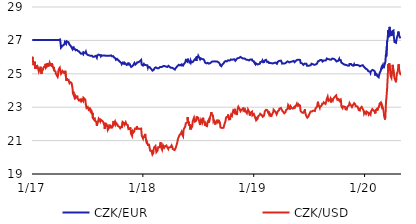
| Category | CZK/EUR | CZK/USD |
|---|---|---|
| 2017-01-02 | 27.02 | 25.819 |
| 2017-01-03 | 27.02 | 26.017 |
| 2017-01-04 | 27.02 | 25.889 |
| 2017-01-05 | 27.02 | 25.714 |
| 2017-01-06 | 27.02 | 25.516 |
| 2017-01-09 | 27.02 | 25.697 |
| 2017-01-10 | 27.02 | 25.571 |
| 2017-01-11 | 27.02 | 25.721 |
| 2017-01-12 | 27.02 | 25.3 |
| 2017-01-13 | 27.02 | 25.347 |
| 2017-01-16 | 27.02 | 25.503 |
| 2017-01-17 | 27.02 | 25.291 |
| 2017-01-18 | 27.02 | 25.335 |
| 2017-01-19 | 27.02 | 25.329 |
| 2017-01-20 | 27.02 | 25.414 |
| 2017-01-23 | 27.025 | 25.22 |
| 2017-01-24 | 27.02 | 25.141 |
| 2017-01-25 | 27.02 | 25.144 |
| 2017-01-26 | 27.02 | 25.252 |
| 2017-01-27 | 27.02 | 25.297 |
| 2017-01-30 | 27.02 | 25.421 |
| 2017-01-31 | 27.02 | 25.12 |
| 2017-02-01 | 27.02 | 25.074 |
| 2017-02-02 | 27.02 | 24.992 |
| 2017-02-03 | 27.02 | 25.155 |
| 2017-02-06 | 27.02 | 25.219 |
| 2017-02-07 | 27.02 | 25.306 |
| 2017-02-08 | 27.02 | 25.333 |
| 2017-02-09 | 27.02 | 25.268 |
| 2017-02-10 | 27.02 | 25.422 |
| 2017-02-13 | 27.02 | 25.421 |
| 2017-02-14 | 27.02 | 25.437 |
| 2017-02-15 | 27.02 | 25.596 |
| 2017-02-16 | 27.02 | 25.36 |
| 2017-02-17 | 27.02 | 25.372 |
| 2017-02-20 | 27.02 | 25.449 |
| 2017-02-21 | 27.02 | 25.644 |
| 2017-02-22 | 27.02 | 25.7 |
| 2017-02-23 | 27.02 | 25.556 |
| 2017-02-24 | 27.02 | 25.468 |
| 2017-02-27 | 27.02 | 25.522 |
| 2017-02-28 | 27.02 | 25.497 |
| 2017-03-01 | 27.02 | 25.654 |
| 2017-03-02 | 27.02 | 25.695 |
| 2017-03-03 | 27.02 | 25.574 |
| 2017-03-06 | 27.02 | 25.506 |
| 2017-03-07 | 27.02 | 25.547 |
| 2017-03-08 | 27.02 | 25.631 |
| 2017-03-09 | 27.02 | 25.613 |
| 2017-03-10 | 27.02 | 25.482 |
| 2017-03-13 | 27.02 | 25.339 |
| 2017-03-14 | 27.02 | 25.415 |
| 2017-03-15 | 27.02 | 25.434 |
| 2017-03-16 | 27.02 | 25.195 |
| 2017-03-17 | 27.02 | 25.154 |
| 2017-03-20 | 27.02 | 25.129 |
| 2017-03-21 | 27.02 | 25.009 |
| 2017-03-22 | 27.02 | 25.003 |
| 2017-03-23 | 27.02 | 25.05 |
| 2017-03-24 | 27.02 | 25.008 |
| 2017-03-27 | 27.02 | 24.813 |
| 2017-03-28 | 27.02 | 24.883 |
| 2017-03-29 | 27.02 | 25.14 |
| 2017-03-30 | 27.02 | 25.159 |
| 2017-03-31 | 27.03 | 25.282 |
| 2017-04-03 | 27.045 | 25.367 |
| 2017-04-04 | 27.055 | 25.404 |
| 2017-04-05 | 27.06 | 25.37 |
| 2017-04-06 | 26.75 | 25.076 |
| 2017-04-07 | 26.565 | 24.999 |
| 2017-04-10 | 26.53 | 25.082 |
| 2017-04-11 | 26.66 | 25.112 |
| 2017-04-12 | 26.695 | 25.172 |
| 2017-04-13 | 26.705 | 25.122 |
| 2017-04-18 | 26.76 | 25.053 |
| 2017-04-19 | 26.795 | 24.985 |
| 2017-04-20 | 26.91 | 25.043 |
| 2017-04-21 | 26.935 | 25.179 |
| 2017-04-24 | 26.795 | 24.706 |
| 2017-04-25 | 26.77 | 24.58 |
| 2017-04-26 | 26.945 | 24.735 |
| 2017-04-27 | 26.935 | 24.752 |
| 2017-04-28 | 26.92 | 24.629 |
| 2017-05-02 | 26.89 | 24.639 |
| 2017-05-03 | 26.87 | 24.607 |
| 2017-05-04 | 26.77 | 24.499 |
| 2017-05-05 | 26.78 | 24.433 |
| 2017-05-09 | 26.67 | 24.497 |
| 2017-05-10 | 26.64 | 24.486 |
| 2017-05-11 | 26.6 | 24.495 |
| 2017-05-12 | 26.575 | 24.435 |
| 2017-05-15 | 26.47 | 24.124 |
| 2017-05-16 | 26.42 | 23.888 |
| 2017-05-17 | 26.435 | 23.778 |
| 2017-05-18 | 26.63 | 23.927 |
| 2017-05-19 | 26.5 | 23.71 |
| 2017-05-22 | 26.485 | 23.557 |
| 2017-05-23 | 26.48 | 23.615 |
| 2017-05-24 | 26.465 | 23.642 |
| 2017-05-25 | 26.41 | 23.552 |
| 2017-05-26 | 26.435 | 23.606 |
| 2017-05-29 | 26.435 | 23.627 |
| 2017-05-30 | 26.465 | 23.69 |
| 2017-05-31 | 26.42 | 23.545 |
| 2017-06-01 | 26.395 | 23.554 |
| 2017-06-02 | 26.36 | 23.501 |
| 2017-06-05 | 26.325 | 23.401 |
| 2017-06-06 | 26.335 | 23.393 |
| 2017-06-07 | 26.315 | 23.459 |
| 2017-06-08 | 26.27 | 23.392 |
| 2017-06-09 | 26.22 | 23.463 |
| 2017-06-12 | 26.2 | 23.348 |
| 2017-06-13 | 26.145 | 23.308 |
| 2017-06-14 | 26.165 | 23.354 |
| 2017-06-15 | 26.21 | 23.468 |
| 2017-06-16 | 26.23 | 23.49 |
| 2017-06-19 | 26.17 | 23.369 |
| 2017-06-20 | 26.295 | 23.568 |
| 2017-06-21 | 26.265 | 23.565 |
| 2017-06-22 | 26.27 | 23.522 |
| 2017-06-23 | 26.295 | 23.53 |
| 2017-06-26 | 26.24 | 23.457 |
| 2017-06-27 | 26.27 | 23.29 |
| 2017-06-28 | 26.325 | 23.141 |
| 2017-06-29 | 26.285 | 23.032 |
| 2017-06-30 | 26.195 | 22.952 |
| 2017-07-03 | 26.14 | 22.993 |
| 2017-07-04 | 26.13 | 23.017 |
| 2017-07-07 | 26.08 | 22.852 |
| 2017-07-10 | 26.095 | 22.917 |
| 2017-07-11 | 26.125 | 22.907 |
| 2017-07-12 | 26.11 | 22.804 |
| 2017-07-13 | 26.12 | 22.878 |
| 2017-07-14 | 26.075 | 22.842 |
| 2017-07-17 | 26.09 | 22.762 |
| 2017-07-18 | 26.08 | 22.57 |
| 2017-07-19 | 26.035 | 22.572 |
| 2017-07-20 | 26.04 | 22.671 |
| 2017-07-21 | 26.02 | 22.347 |
| 2017-07-24 | 26.025 | 22.344 |
| 2017-07-25 | 26.02 | 22.25 |
| 2017-07-26 | 26.045 | 22.371 |
| 2017-07-27 | 26.045 | 22.269 |
| 2017-07-28 | 26.05 | 22.209 |
| 2017-07-31 | 26.08 | 22.24 |
| 2017-08-01 | 26.13 | 22.123 |
| 2017-08-02 | 26.125 | 22.099 |
| 2017-08-03 | 25.965 | 21.89 |
| 2017-08-04 | 26.065 | 21.961 |
| 2017-08-07 | 26.115 | 22.135 |
| 2017-08-08 | 26.15 | 22.134 |
| 2017-08-09 | 26.16 | 22.301 |
| 2017-08-10 | 26.16 | 22.297 |
| 2017-08-11 | 26.155 | 22.232 |
| 2017-08-14 | 26.12 | 22.143 |
| 2017-08-15 | 26.14 | 22.26 |
| 2017-08-16 | 26.045 | 22.243 |
| 2017-08-17 | 26.01 | 22.24 |
| 2017-08-18 | 26.11 | 22.243 |
| 2017-08-21 | 26.085 | 22.177 |
| 2017-08-22 | 26.085 | 22.16 |
| 2017-08-23 | 26.125 | 22.14 |
| 2017-08-24 | 26.1 | 22.106 |
| 2017-08-25 | 26.085 | 22.098 |
| 2017-08-28 | 26.1 | 21.887 |
| 2017-08-29 | 26.14 | 21.697 |
| 2017-08-30 | 26.045 | 21.849 |
| 2017-08-31 | 26.105 | 22.073 |
| 2017-09-01 | 26.075 | 21.871 |
| 2017-09-04 | 26.06 | 21.895 |
| 2017-09-05 | 26.075 | 21.928 |
| 2017-09-06 | 26.11 | 21.88 |
| 2017-09-07 | 26.11 | 21.801 |
| 2017-09-08 | 26.1 | 21.641 |
| 2017-09-11 | 26.075 | 21.736 |
| 2017-09-12 | 26.105 | 21.87 |
| 2017-09-13 | 26.1 | 21.787 |
| 2017-09-14 | 26.1 | 21.953 |
| 2017-09-15 | 26.08 | 21.794 |
| 2017-09-18 | 26.09 | 21.836 |
| 2017-09-19 | 26.105 | 21.809 |
| 2017-09-20 | 26.09 | 21.734 |
| 2017-09-21 | 26.085 | 21.891 |
| 2017-09-22 | 26.045 | 21.771 |
| 2017-09-25 | 26.035 | 21.937 |
| 2017-09-26 | 26.055 | 22.103 |
| 2017-09-27 | 26.035 | 22.176 |
| 2017-09-29 | 25.975 | 22.003 |
| 2017-10-02 | 25.995 | 22.135 |
| 2017-10-03 | 25.93 | 22.065 |
| 2017-10-04 | 25.885 | 21.97 |
| 2017-10-05 | 25.835 | 22.003 |
| 2017-10-06 | 25.815 | 22.05 |
| 2017-10-09 | 25.89 | 22.044 |
| 2017-10-10 | 25.9 | 21.96 |
| 2017-10-11 | 25.88 | 21.878 |
| 2017-10-12 | 25.89 | 21.837 |
| 2017-10-13 | 25.81 | 21.852 |
| 2017-10-16 | 25.765 | 21.828 |
| 2017-10-17 | 25.735 | 21.885 |
| 2017-10-18 | 25.705 | 21.881 |
| 2017-10-19 | 25.725 | 21.736 |
| 2017-10-20 | 25.69 | 21.739 |
| 2017-10-23 | 25.64 | 21.84 |
| 2017-10-24 | 25.58 | 21.753 |
| 2017-10-25 | 25.59 | 21.715 |
| 2017-10-26 | 25.585 | 21.779 |
| 2017-10-27 | 25.67 | 22.117 |
| 2017-10-30 | 25.645 | 22.086 |
| 2017-10-31 | 25.67 | 22.06 |
| 2017-11-01 | 25.555 | 22.008 |
| 2017-11-02 | 25.56 | 21.949 |
| 2017-11-03 | 25.65 | 22.006 |
| 2017-11-06 | 25.61 | 22.098 |
| 2017-11-07 | 25.59 | 22.132 |
| 2017-11-08 | 25.56 | 22.053 |
| 2017-11-09 | 25.53 | 21.954 |
| 2017-11-10 | 25.545 | 21.923 |
| 2017-11-13 | 25.565 | 21.929 |
| 2017-11-14 | 25.565 | 21.766 |
| 2017-11-15 | 25.67 | 21.684 |
| 2017-11-16 | 25.56 | 21.712 |
| 2017-11-20 | 25.565 | 21.701 |
| 2017-11-21 | 25.53 | 21.791 |
| 2017-11-22 | 25.47 | 21.677 |
| 2017-11-23 | 25.46 | 21.487 |
| 2017-11-24 | 25.41 | 21.392 |
| 2017-11-27 | 25.43 | 21.279 |
| 2017-11-28 | 25.46 | 21.418 |
| 2017-11-29 | 25.475 | 21.542 |
| 2017-11-30 | 25.495 | 21.519 |
| 2017-12-01 | 25.525 | 21.475 |
| 2017-12-04 | 25.56 | 21.541 |
| 2017-12-05 | 25.655 | 21.656 |
| 2017-12-06 | 25.635 | 21.695 |
| 2017-12-07 | 25.61 | 21.727 |
| 2017-12-08 | 25.555 | 21.765 |
| 2017-12-11 | 25.6 | 21.705 |
| 2017-12-12 | 25.625 | 21.776 |
| 2017-12-13 | 25.65 | 21.86 |
| 2017-12-14 | 25.685 | 21.682 |
| 2017-12-15 | 25.68 | 21.75 |
| 2017-12-18 | 25.685 | 21.775 |
| 2017-12-19 | 25.66 | 21.702 |
| 2017-12-20 | 25.675 | 21.677 |
| 2017-12-21 | 25.715 | 21.684 |
| 2017-12-22 | 25.75 | 21.725 |
| 2017-12-27 | 25.84 | 21.723 |
| 2017-12-28 | 25.645 | 21.489 |
| 2017-12-29 | 25.54 | 21.291 |
| 2018-01-02 | 25.495 | 21.13 |
| 2018-01-03 | 25.545 | 21.238 |
| 2018-01-04 | 25.51 | 21.16 |
| 2018-01-05 | 25.595 | 21.248 |
| 2018-01-08 | 25.525 | 21.324 |
| 2018-01-09 | 25.535 | 21.399 |
| 2018-01-10 | 25.565 | 21.315 |
| 2018-01-11 | 25.545 | 21.256 |
| 2018-01-12 | 25.52 | 21.025 |
| 2018-01-15 | 25.53 | 20.796 |
| 2018-01-16 | 25.515 | 20.863 |
| 2018-01-17 | 25.445 | 20.852 |
| 2018-01-18 | 25.37 | 20.742 |
| 2018-01-19 | 25.43 | 20.749 |
| 2018-01-22 | 25.4 | 20.752 |
| 2018-01-23 | 25.405 | 20.742 |
| 2018-01-24 | 25.375 | 20.543 |
| 2018-01-25 | 25.38 | 20.454 |
| 2018-01-26 | 25.355 | 20.392 |
| 2018-01-29 | 25.295 | 20.432 |
| 2018-01-30 | 25.33 | 20.394 |
| 2018-01-31 | 25.27 | 20.291 |
| 2018-02-01 | 25.265 | 20.281 |
| 2018-02-02 | 25.19 | 20.163 |
| 2018-02-05 | 25.2 | 20.256 |
| 2018-02-06 | 25.23 | 20.464 |
| 2018-02-07 | 25.23 | 20.448 |
| 2018-02-08 | 25.245 | 20.595 |
| 2018-02-09 | 25.335 | 20.645 |
| 2018-02-12 | 25.355 | 20.677 |
| 2018-02-13 | 25.385 | 20.583 |
| 2018-02-14 | 25.36 | 20.539 |
| 2018-02-15 | 25.37 | 20.307 |
| 2018-02-16 | 25.34 | 20.327 |
| 2018-02-19 | 25.325 | 20.406 |
| 2018-02-20 | 25.315 | 20.515 |
| 2018-02-21 | 25.36 | 20.604 |
| 2018-02-22 | 25.315 | 20.623 |
| 2018-02-23 | 25.335 | 20.603 |
| 2018-02-26 | 25.39 | 20.608 |
| 2018-02-27 | 25.405 | 20.652 |
| 2018-02-28 | 25.42 | 20.816 |
| 2018-03-01 | 25.435 | 20.898 |
| 2018-03-02 | 25.41 | 20.638 |
| 2018-03-05 | 25.405 | 20.642 |
| 2018-03-06 | 25.38 | 20.45 |
| 2018-03-07 | 25.415 | 20.47 |
| 2018-03-08 | 25.43 | 20.472 |
| 2018-03-09 | 25.455 | 20.717 |
| 2018-03-12 | 25.45 | 20.688 |
| 2018-03-13 | 25.47 | 20.577 |
| 2018-03-14 | 25.445 | 20.573 |
| 2018-03-15 | 25.415 | 20.594 |
| 2018-03-16 | 25.415 | 20.666 |
| 2018-03-19 | 25.43 | 20.661 |
| 2018-03-20 | 25.42 | 20.707 |
| 2018-03-21 | 25.42 | 20.689 |
| 2018-03-22 | 25.4 | 20.624 |
| 2018-03-23 | 25.405 | 20.586 |
| 2018-03-26 | 25.445 | 20.506 |
| 2018-03-27 | 25.475 | 20.586 |
| 2018-03-28 | 25.46 | 20.533 |
| 2018-03-29 | 25.43 | 20.641 |
| 2018-04-03 | 25.365 | 20.608 |
| 2018-04-04 | 25.34 | 20.645 |
| 2018-04-05 | 25.325 | 20.655 |
| 2018-04-06 | 25.34 | 20.714 |
| 2018-04-09 | 25.355 | 20.608 |
| 2018-04-10 | 25.335 | 20.497 |
| 2018-04-11 | 25.325 | 20.449 |
| 2018-04-12 | 25.315 | 20.548 |
| 2018-04-13 | 25.305 | 20.545 |
| 2018-04-16 | 25.26 | 20.435 |
| 2018-04-17 | 25.255 | 20.439 |
| 2018-04-18 | 25.3 | 20.424 |
| 2018-04-19 | 25.325 | 20.454 |
| 2018-04-20 | 25.34 | 20.584 |
| 2018-04-23 | 25.41 | 20.763 |
| 2018-04-24 | 25.435 | 20.827 |
| 2018-04-25 | 25.465 | 20.899 |
| 2018-04-26 | 25.475 | 20.944 |
| 2018-04-27 | 25.47 | 21.102 |
| 2018-04-30 | 25.54 | 21.144 |
| 2018-05-02 | 25.595 | 21.319 |
| 2018-05-03 | 25.58 | 21.332 |
| 2018-05-04 | 25.505 | 21.31 |
| 2018-05-07 | 25.515 | 21.438 |
| 2018-05-09 | 25.565 | 21.525 |
| 2018-05-10 | 25.495 | 21.465 |
| 2018-05-11 | 25.505 | 21.37 |
| 2018-05-14 | 25.49 | 21.264 |
| 2018-05-15 | 25.55 | 21.501 |
| 2018-05-16 | 25.545 | 21.679 |
| 2018-05-17 | 25.56 | 21.646 |
| 2018-05-18 | 25.59 | 21.718 |
| 2018-05-21 | 25.68 | 21.84 |
| 2018-05-22 | 25.7 | 21.791 |
| 2018-05-23 | 25.815 | 22.041 |
| 2018-05-24 | 25.81 | 22.011 |
| 2018-05-25 | 25.765 | 22.07 |
| 2018-05-28 | 25.73 | 22.095 |
| 2018-05-29 | 25.905 | 22.413 |
| 2018-05-30 | 25.835 | 22.202 |
| 2018-05-31 | 25.79 | 22.05 |
| 2018-06-01 | 25.83 | 22.137 |
| 2018-06-04 | 25.7 | 21.897 |
| 2018-06-05 | 25.65 | 21.971 |
| 2018-06-06 | 25.645 | 21.798 |
| 2018-06-07 | 25.64 | 21.662 |
| 2018-06-08 | 25.795 | 21.944 |
| 2018-06-11 | 25.68 | 21.781 |
| 2018-06-12 | 25.65 | 21.757 |
| 2018-06-13 | 25.71 | 21.856 |
| 2018-06-14 | 25.65 | 21.866 |
| 2018-06-15 | 25.71 | 22.171 |
| 2018-06-18 | 25.74 | 22.165 |
| 2018-06-19 | 25.81 | 22.373 |
| 2018-06-20 | 25.835 | 22.316 |
| 2018-06-21 | 25.865 | 22.413 |
| 2018-06-22 | 25.79 | 22.139 |
| 2018-06-25 | 25.935 | 22.172 |
| 2018-06-26 | 25.9 | 22.188 |
| 2018-06-27 | 25.77 | 22.184 |
| 2018-06-28 | 26 | 22.448 |
| 2018-06-29 | 26.02 | 22.318 |
| 2018-07-02 | 26 | 22.343 |
| 2018-07-03 | 26.075 | 22.356 |
| 2018-07-04 | 26.03 | 22.357 |
| 2018-07-09 | 25.86 | 21.934 |
| 2018-07-10 | 25.9 | 22.113 |
| 2018-07-11 | 25.93 | 22.099 |
| 2018-07-12 | 25.94 | 22.25 |
| 2018-07-13 | 25.92 | 22.262 |
| 2018-07-16 | 25.88 | 22.082 |
| 2018-07-17 | 25.875 | 22.1 |
| 2018-07-18 | 25.855 | 22.268 |
| 2018-07-19 | 25.92 | 22.368 |
| 2018-07-20 | 25.875 | 22.175 |
| 2018-07-23 | 25.85 | 22.065 |
| 2018-07-24 | 25.76 | 22.006 |
| 2018-07-25 | 25.675 | 21.965 |
| 2018-07-26 | 25.645 | 21.891 |
| 2018-07-27 | 25.62 | 22.039 |
| 2018-07-30 | 25.625 | 21.931 |
| 2018-07-31 | 25.6 | 21.814 |
| 2018-08-01 | 25.59 | 21.889 |
| 2018-08-02 | 25.6 | 22.04 |
| 2018-08-03 | 25.66 | 22.144 |
| 2018-08-06 | 25.65 | 22.221 |
| 2018-08-07 | 25.605 | 22.072 |
| 2018-08-08 | 25.58 | 22.076 |
| 2018-08-09 | 25.57 | 22.057 |
| 2018-08-10 | 25.635 | 22.377 |
| 2018-08-13 | 25.66 | 22.503 |
| 2018-08-14 | 25.69 | 22.524 |
| 2018-08-15 | 25.71 | 22.709 |
| 2018-08-16 | 25.7 | 22.606 |
| 2018-08-17 | 25.73 | 22.583 |
| 2018-08-20 | 25.705 | 22.509 |
| 2018-08-21 | 25.74 | 22.376 |
| 2018-08-22 | 25.725 | 22.149 |
| 2018-08-23 | 25.71 | 22.207 |
| 2018-08-24 | 25.745 | 22.218 |
| 2018-08-27 | 25.745 | 22.127 |
| 2018-08-28 | 25.72 | 21.963 |
| 2018-08-29 | 25.745 | 22.08 |
| 2018-08-30 | 25.75 | 22.025 |
| 2018-08-31 | 25.735 | 22.089 |
| 2018-09-03 | 25.75 | 22.183 |
| 2018-09-04 | 25.73 | 22.256 |
| 2018-09-05 | 25.745 | 22.238 |
| 2018-09-06 | 25.715 | 22.09 |
| 2018-09-07 | 25.695 | 22.124 |
| 2018-09-10 | 25.65 | 22.166 |
| 2018-09-11 | 25.65 | 22.157 |
| 2018-09-12 | 25.59 | 22.096 |
| 2018-09-13 | 25.52 | 21.965 |
| 2018-09-14 | 25.475 | 21.79 |
| 2018-09-17 | 25.455 | 21.811 |
| 2018-09-18 | 25.45 | 21.761 |
| 2018-09-19 | 25.43 | 21.796 |
| 2018-09-20 | 25.56 | 21.71 |
| 2018-09-21 | 25.585 | 21.756 |
| 2018-09-24 | 25.615 | 21.763 |
| 2018-09-25 | 25.615 | 21.752 |
| 2018-09-26 | 25.605 | 21.819 |
| 2018-09-27 | 25.715 | 21.967 |
| 2018-10-01 | 25.765 | 22.201 |
| 2018-10-02 | 25.79 | 22.343 |
| 2018-10-03 | 25.78 | 22.329 |
| 2018-10-04 | 25.78 | 22.415 |
| 2018-10-05 | 25.74 | 22.372 |
| 2018-10-08 | 25.735 | 22.426 |
| 2018-10-09 | 25.805 | 22.564 |
| 2018-10-10 | 25.805 | 22.44 |
| 2018-10-11 | 25.85 | 22.335 |
| 2018-10-12 | 25.775 | 22.269 |
| 2018-10-15 | 25.8 | 22.277 |
| 2018-10-16 | 25.815 | 22.283 |
| 2018-10-17 | 25.845 | 22.418 |
| 2018-10-18 | 25.86 | 22.476 |
| 2018-10-19 | 25.865 | 22.552 |
| 2018-10-22 | 25.84 | 22.483 |
| 2018-10-23 | 25.815 | 22.49 |
| 2018-10-24 | 25.83 | 22.685 |
| 2018-10-25 | 25.83 | 22.627 |
| 2018-10-26 | 25.86 | 22.797 |
| 2018-10-29 | 25.85 | 22.715 |
| 2018-10-30 | 25.87 | 22.75 |
| 2018-10-31 | 25.92 | 22.902 |
| 2018-11-01 | 25.875 | 22.712 |
| 2018-11-02 | 25.78 | 22.581 |
| 2018-11-05 | 25.845 | 22.73 |
| 2018-11-06 | 25.835 | 22.606 |
| 2018-11-07 | 25.88 | 22.531 |
| 2018-11-08 | 25.885 | 22.653 |
| 2018-11-09 | 25.935 | 22.857 |
| 2018-11-12 | 25.94 | 23.029 |
| 2018-11-13 | 25.94 | 23.032 |
| 2018-11-14 | 25.995 | 23.013 |
| 2018-11-15 | 25.985 | 22.992 |
| 2018-11-16 | 25.985 | 22.903 |
| 2018-11-19 | 26.01 | 22.761 |
| 2018-11-20 | 26.03 | 22.794 |
| 2018-11-21 | 26 | 22.788 |
| 2018-11-22 | 25.99 | 22.79 |
| 2018-11-23 | 25.955 | 22.866 |
| 2018-11-26 | 25.92 | 22.808 |
| 2018-11-27 | 25.915 | 22.874 |
| 2018-11-28 | 25.93 | 22.977 |
| 2018-11-29 | 25.965 | 22.802 |
| 2018-11-30 | 25.955 | 22.848 |
| 2018-12-03 | 25.92 | 22.874 |
| 2018-12-04 | 25.9 | 22.702 |
| 2018-12-05 | 25.885 | 22.802 |
| 2018-12-06 | 25.89 | 22.796 |
| 2018-12-07 | 25.85 | 22.736 |
| 2018-12-10 | 25.865 | 22.64 |
| 2018-12-11 | 25.845 | 22.711 |
| 2018-12-12 | 25.865 | 22.796 |
| 2018-12-13 | 25.83 | 22.716 |
| 2018-12-14 | 25.795 | 22.858 |
| 2018-12-17 | 25.8 | 22.749 |
| 2018-12-18 | 25.755 | 22.638 |
| 2018-12-19 | 25.76 | 22.591 |
| 2018-12-20 | 25.76 | 22.497 |
| 2018-12-21 | 25.855 | 22.654 |
| 2018-12-27 | 25.86 | 22.733 |
| 2018-12-28 | 25.78 | 22.506 |
| 2018-12-31 | 25.725 | 22.466 |
| 2019-01-02 | 25.75 | 22.594 |
| 2019-01-03 | 25.68 | 22.634 |
| 2019-01-04 | 25.65 | 22.494 |
| 2019-01-07 | 25.575 | 22.347 |
| 2019-01-08 | 25.64 | 22.416 |
| 2019-01-09 | 25.63 | 22.376 |
| 2019-01-10 | 25.625 | 22.221 |
| 2019-01-11 | 25.605 | 22.199 |
| 2019-01-14 | 25.56 | 22.29 |
| 2019-01-15 | 25.57 | 22.382 |
| 2019-01-16 | 25.565 | 22.446 |
| 2019-01-17 | 25.535 | 22.407 |
| 2019-01-18 | 25.58 | 22.432 |
| 2019-01-21 | 25.595 | 22.528 |
| 2019-01-22 | 25.61 | 22.559 |
| 2019-01-23 | 25.695 | 22.605 |
| 2019-01-24 | 25.695 | 22.659 |
| 2019-01-25 | 25.695 | 22.644 |
| 2019-01-28 | 25.725 | 22.529 |
| 2019-01-29 | 25.745 | 22.541 |
| 2019-01-30 | 25.8 | 22.579 |
| 2019-01-31 | 25.76 | 22.427 |
| 2019-02-01 | 25.695 | 22.398 |
| 2019-02-04 | 25.73 | 22.48 |
| 2019-02-05 | 25.7 | 22.508 |
| 2019-02-06 | 25.785 | 22.629 |
| 2019-02-07 | 25.805 | 22.747 |
| 2019-02-08 | 25.805 | 22.745 |
| 2019-02-11 | 25.835 | 22.845 |
| 2019-02-12 | 25.87 | 22.901 |
| 2019-02-13 | 25.795 | 22.819 |
| 2019-02-14 | 25.79 | 22.885 |
| 2019-02-15 | 25.7 | 22.823 |
| 2019-02-18 | 25.715 | 22.703 |
| 2019-02-19 | 25.715 | 22.771 |
| 2019-02-20 | 25.68 | 22.646 |
| 2019-02-21 | 25.645 | 22.586 |
| 2019-02-22 | 25.665 | 22.662 |
| 2019-02-25 | 25.65 | 22.589 |
| 2019-02-26 | 25.665 | 22.594 |
| 2019-02-27 | 25.655 | 22.532 |
| 2019-02-28 | 25.6 | 22.425 |
| 2019-03-01 | 25.635 | 22.52 |
| 2019-03-04 | 25.625 | 22.6 |
| 2019-03-05 | 25.62 | 22.614 |
| 2019-03-06 | 25.595 | 22.641 |
| 2019-03-07 | 25.61 | 22.72 |
| 2019-03-08 | 25.64 | 22.848 |
| 2019-03-11 | 25.655 | 22.818 |
| 2019-03-12 | 25.67 | 22.768 |
| 2019-03-13 | 25.67 | 22.711 |
| 2019-03-14 | 25.67 | 22.724 |
| 2019-03-15 | 25.67 | 22.694 |
| 2019-03-18 | 25.615 | 22.571 |
| 2019-03-19 | 25.6 | 22.537 |
| 2019-03-20 | 25.645 | 22.587 |
| 2019-03-21 | 25.65 | 22.528 |
| 2019-03-22 | 25.725 | 22.761 |
| 2019-03-25 | 25.76 | 22.752 |
| 2019-03-26 | 25.77 | 22.823 |
| 2019-03-27 | 25.8 | 22.912 |
| 2019-03-28 | 25.78 | 22.934 |
| 2019-03-29 | 25.8 | 22.968 |
| 2019-04-01 | 25.79 | 22.955 |
| 2019-04-02 | 25.75 | 22.99 |
| 2019-04-03 | 25.725 | 22.876 |
| 2019-04-04 | 25.695 | 22.91 |
| 2019-04-05 | 25.61 | 22.8 |
| 2019-04-08 | 25.635 | 22.794 |
| 2019-04-09 | 25.62 | 22.716 |
| 2019-04-10 | 25.61 | 22.711 |
| 2019-04-11 | 25.605 | 22.732 |
| 2019-04-12 | 25.62 | 22.633 |
| 2019-04-15 | 25.625 | 22.653 |
| 2019-04-16 | 25.665 | 22.701 |
| 2019-04-17 | 25.655 | 22.702 |
| 2019-04-18 | 25.68 | 22.826 |
| 2019-04-23 | 25.745 | 22.896 |
| 2019-04-24 | 25.73 | 22.95 |
| 2019-04-25 | 25.735 | 23.137 |
| 2019-04-26 | 25.705 | 23.091 |
| 2019-04-29 | 25.68 | 23.028 |
| 2019-04-30 | 25.66 | 22.864 |
| 2019-05-02 | 25.645 | 22.875 |
| 2019-05-03 | 25.715 | 23.055 |
| 2019-05-06 | 25.715 | 22.962 |
| 2019-05-07 | 25.73 | 23.005 |
| 2019-05-09 | 25.72 | 22.983 |
| 2019-05-10 | 25.73 | 22.915 |
| 2019-05-13 | 25.775 | 22.918 |
| 2019-05-14 | 25.75 | 22.942 |
| 2019-05-15 | 25.76 | 23.035 |
| 2019-05-16 | 25.695 | 22.933 |
| 2019-05-17 | 25.75 | 23.048 |
| 2019-05-20 | 25.765 | 23.073 |
| 2019-05-21 | 25.775 | 23.096 |
| 2019-05-22 | 25.79 | 23.089 |
| 2019-05-23 | 25.82 | 23.181 |
| 2019-05-24 | 25.83 | 23.091 |
| 2019-05-27 | 25.835 | 23.074 |
| 2019-05-28 | 25.845 | 23.092 |
| 2019-05-29 | 25.86 | 23.179 |
| 2019-05-30 | 25.84 | 23.208 |
| 2019-05-31 | 25.817 | 23.153 |
| 2019-06-03 | 25.83 | 23.093 |
| 2019-06-04 | 25.745 | 22.906 |
| 2019-06-05 | 25.65 | 22.77 |
| 2019-06-06 | 25.66 | 22.775 |
| 2019-06-07 | 25.64 | 22.745 |
| 2019-06-10 | 25.625 | 22.675 |
| 2019-06-11 | 25.64 | 22.651 |
| 2019-06-12 | 25.615 | 22.623 |
| 2019-06-13 | 25.58 | 22.659 |
| 2019-06-14 | 25.54 | 22.674 |
| 2019-06-17 | 25.56 | 22.752 |
| 2019-06-18 | 25.61 | 22.797 |
| 2019-06-19 | 25.635 | 22.874 |
| 2019-06-20 | 25.62 | 22.663 |
| 2019-06-21 | 25.61 | 22.632 |
| 2019-06-24 | 25.6 | 22.465 |
| 2019-06-25 | 25.555 | 22.438 |
| 2019-06-26 | 25.485 | 22.434 |
| 2019-06-27 | 25.435 | 22.372 |
| 2019-06-28 | 25.445 | 22.363 |
| 2019-07-01 | 25.48 | 22.453 |
| 2019-07-02 | 25.46 | 22.527 |
| 2019-07-03 | 25.455 | 22.535 |
| 2019-07-04 | 25.435 | 22.534 |
| 2019-07-08 | 25.51 | 22.745 |
| 2019-07-09 | 25.545 | 22.8 |
| 2019-07-10 | 25.565 | 22.785 |
| 2019-07-11 | 25.605 | 22.689 |
| 2019-07-12 | 25.59 | 22.742 |
| 2019-07-15 | 25.575 | 22.694 |
| 2019-07-16 | 25.575 | 22.796 |
| 2019-07-17 | 25.605 | 22.829 |
| 2019-07-18 | 25.585 | 22.811 |
| 2019-07-19 | 25.545 | 22.756 |
| 2019-07-22 | 25.535 | 22.771 |
| 2019-07-23 | 25.545 | 22.866 |
| 2019-07-24 | 25.54 | 22.927 |
| 2019-07-25 | 25.52 | 22.961 |
| 2019-07-26 | 25.54 | 22.932 |
| 2019-07-29 | 25.61 | 23.033 |
| 2019-07-30 | 25.65 | 22.996 |
| 2019-07-31 | 25.66 | 23.014 |
| 2019-08-01 | 25.74 | 23.326 |
| 2019-08-02 | 25.765 | 23.199 |
| 2019-08-05 | 25.775 | 23.052 |
| 2019-08-06 | 25.725 | 22.999 |
| 2019-08-07 | 25.72 | 22.96 |
| 2019-08-08 | 25.79 | 23.041 |
| 2019-08-09 | 25.83 | 23.068 |
| 2019-08-12 | 25.83 | 23.074 |
| 2019-08-13 | 25.83 | 23.019 |
| 2019-08-14 | 25.885 | 23.135 |
| 2019-08-15 | 25.88 | 23.211 |
| 2019-08-16 | 25.735 | 23.236 |
| 2019-08-19 | 25.78 | 23.219 |
| 2019-08-20 | 25.795 | 23.289 |
| 2019-08-21 | 25.795 | 23.231 |
| 2019-08-22 | 25.785 | 23.261 |
| 2019-08-23 | 25.765 | 23.274 |
| 2019-08-26 | 25.79 | 23.199 |
| 2019-08-27 | 25.815 | 23.252 |
| 2019-08-28 | 25.845 | 23.322 |
| 2019-08-29 | 25.85 | 23.344 |
| 2019-08-30 | 25.915 | 23.484 |
| 2019-09-02 | 25.92 | 23.632 |
| 2019-09-03 | 25.885 | 23.665 |
| 2019-09-04 | 25.835 | 23.444 |
| 2019-09-05 | 25.85 | 23.379 |
| 2019-09-06 | 25.835 | 23.424 |
| 2019-09-09 | 25.855 | 23.431 |
| 2019-09-10 | 25.865 | 23.431 |
| 2019-09-11 | 25.865 | 23.507 |
| 2019-09-12 | 25.83 | 23.565 |
| 2019-09-13 | 25.845 | 23.286 |
| 2019-09-16 | 25.88 | 23.461 |
| 2019-09-17 | 25.915 | 23.499 |
| 2019-09-18 | 25.89 | 23.424 |
| 2019-09-19 | 25.895 | 23.398 |
| 2019-09-20 | 25.91 | 23.49 |
| 2019-09-23 | 25.89 | 23.567 |
| 2019-09-24 | 25.87 | 23.514 |
| 2019-09-25 | 25.86 | 23.55 |
| 2019-09-26 | 25.85 | 23.636 |
| 2019-09-27 | 25.84 | 23.633 |
| 2019-09-30 | 25.815 | 23.707 |
| 2019-10-01 | 25.74 | 23.618 |
| 2019-10-02 | 25.74 | 23.561 |
| 2019-10-03 | 25.74 | 23.506 |
| 2019-10-04 | 25.74 | 23.444 |
| 2019-10-07 | 25.78 | 23.451 |
| 2019-10-08 | 25.805 | 23.488 |
| 2019-10-09 | 25.825 | 23.518 |
| 2019-10-10 | 25.89 | 23.476 |
| 2019-10-11 | 25.81 | 23.372 |
| 2019-10-14 | 25.825 | 23.411 |
| 2019-10-15 | 25.82 | 23.458 |
| 2019-10-16 | 25.76 | 23.365 |
| 2019-10-17 | 25.67 | 23.107 |
| 2019-10-18 | 25.66 | 23.026 |
| 2019-10-21 | 25.63 | 22.94 |
| 2019-10-22 | 25.575 | 22.974 |
| 2019-10-23 | 25.635 | 23.051 |
| 2019-10-24 | 25.595 | 23.003 |
| 2019-10-25 | 25.57 | 23.022 |
| 2019-10-29 | 25.545 | 23.022 |
| 2019-10-30 | 25.51 | 22.969 |
| 2019-10-31 | 25.51 | 22.871 |
| 2019-11-01 | 25.515 | 22.906 |
| 2019-11-04 | 25.515 | 22.866 |
| 2019-11-05 | 25.535 | 22.984 |
| 2019-11-06 | 25.5 | 22.98 |
| 2019-11-07 | 25.53 | 23.048 |
| 2019-11-08 | 25.485 | 23.099 |
| 2019-11-11 | 25.51 | 23.103 |
| 2019-11-12 | 25.5 | 23.152 |
| 2019-11-13 | 25.59 | 23.247 |
| 2019-11-14 | 25.56 | 23.232 |
| 2019-11-15 | 25.58 | 23.185 |
| 2019-11-18 | 25.59 | 23.135 |
| 2019-11-19 | 25.565 | 23.081 |
| 2019-11-20 | 25.535 | 23.099 |
| 2019-11-21 | 25.52 | 23.01 |
| 2019-11-22 | 25.51 | 23.069 |
| 2019-11-25 | 25.485 | 23.151 |
| 2019-11-26 | 25.505 | 23.145 |
| 2019-11-27 | 25.515 | 23.176 |
| 2019-11-28 | 25.575 | 23.24 |
| 2019-11-29 | 25.515 | 23.233 |
| 2019-12-02 | 25.535 | 23.166 |
| 2019-12-03 | 25.525 | 23.056 |
| 2019-12-04 | 25.52 | 23.016 |
| 2019-12-05 | 25.525 | 23.009 |
| 2019-12-06 | 25.535 | 23.017 |
| 2019-12-09 | 25.525 | 23.047 |
| 2019-12-10 | 25.525 | 23.043 |
| 2019-12-11 | 25.52 | 23.042 |
| 2019-12-12 | 25.52 | 22.915 |
| 2019-12-13 | 25.51 | 22.831 |
| 2019-12-16 | 25.485 | 22.863 |
| 2019-12-17 | 25.45 | 22.801 |
| 2019-12-18 | 25.49 | 22.933 |
| 2019-12-19 | 25.475 | 22.915 |
| 2019-12-20 | 25.445 | 22.937 |
| 2019-12-23 | 25.5 | 23.025 |
| 2019-12-27 | 25.51 | 22.873 |
| 2019-12-30 | 25.46 | 22.757 |
| 2019-12-31 | 25.41 | 22.621 |
| 2020-01-02 | 25.41 | 22.702 |
| 2020-01-03 | 25.36 | 22.753 |
| 2020-01-06 | 25.3 | 22.601 |
| 2020-01-07 | 25.275 | 22.626 |
| 2020-01-08 | 25.265 | 22.739 |
| 2020-01-09 | 25.255 | 22.733 |
| 2020-01-10 | 25.265 | 22.78 |
| 2020-01-13 | 25.23 | 22.677 |
| 2020-01-14 | 25.155 | 22.634 |
| 2020-01-15 | 25.145 | 22.567 |
| 2020-01-16 | 25.17 | 22.538 |
| 2020-01-17 | 25.145 | 22.638 |
| 2020-01-20 | 25.125 | 22.667 |
| 2020-01-21 | 25.065 | 22.552 |
| 2020-01-22 | 25.135 | 22.668 |
| 2020-01-23 | 25.16 | 22.686 |
| 2020-01-24 | 25.16 | 22.798 |
| 2020-01-27 | 25.23 | 22.883 |
| 2020-01-28 | 25.22 | 22.916 |
| 2020-01-29 | 25.205 | 22.913 |
| 2020-01-30 | 25.25 | 22.894 |
| 2020-01-31 | 25.21 | 22.81 |
| 2020-02-03 | 25.175 | 22.75 |
| 2020-02-04 | 25.145 | 22.761 |
| 2020-02-05 | 25.05 | 22.732 |
| 2020-02-06 | 24.895 | 22.627 |
| 2020-02-07 | 25.03 | 22.817 |
| 2020-02-10 | 25.025 | 22.851 |
| 2020-02-11 | 24.965 | 22.897 |
| 2020-02-12 | 24.875 | 22.792 |
| 2020-02-13 | 24.835 | 22.851 |
| 2020-02-14 | 24.825 | 22.897 |
| 2020-02-17 | 24.795 | 22.883 |
| 2020-02-18 | 24.9 | 23.023 |
| 2020-02-19 | 24.96 | 23.113 |
| 2020-02-20 | 25.035 | 23.205 |
| 2020-02-21 | 25.06 | 23.206 |
| 2020-02-24 | 25.19 | 23.284 |
| 2020-02-25 | 25.225 | 23.269 |
| 2020-02-26 | 25.345 | 23.308 |
| 2020-02-27 | 25.285 | 23.062 |
| 2020-02-28 | 25.39 | 23.124 |
| 2020-03-02 | 25.525 | 22.952 |
| 2020-03-03 | 25.475 | 22.919 |
| 2020-03-04 | 25.34 | 22.779 |
| 2020-03-05 | 25.355 | 22.665 |
| 2020-03-06 | 25.46 | 22.459 |
| 2020-03-09 | 25.505 | 22.265 |
| 2020-03-10 | 25.715 | 22.57 |
| 2020-03-11 | 25.77 | 22.737 |
| 2020-03-12 | 26.2 | 23.31 |
| 2020-03-13 | 26.04 | 23.449 |
| 2020-03-16 | 26.96 | 24.169 |
| 2020-03-17 | 26.98 | 24.569 |
| 2020-03-18 | 27.16 | 24.834 |
| 2020-03-19 | 27.605 | 25.567 |
| 2020-03-20 | 27.19 | 25.406 |
| 2020-03-23 | 27.635 | 25.629 |
| 2020-03-24 | 27.81 | 25.648 |
| 2020-03-25 | 27.44 | 25.351 |
| 2020-03-26 | 27.55 | 25.084 |
| 2020-03-27 | 27.3 | 24.879 |
| 2020-03-30 | 27.315 | 24.759 |
| 2020-03-31 | 27.325 | 24.943 |
| 2020-04-01 | 27.38 | 25.039 |
| 2020-04-02 | 27.555 | 25.287 |
| 2020-04-03 | 27.54 | 25.535 |
| 2020-04-06 | 27.595 | 25.567 |
| 2020-04-07 | 27.215 | 24.995 |
| 2020-04-08 | 27.2 | 25.021 |
| 2020-04-09 | 26.905 | 24.758 |
| 2020-04-14 | 26.855 | 24.494 |
| 2020-04-15 | 26.99 | 24.751 |
| 2020-04-16 | 27.055 | 24.85 |
| 2020-04-17 | 27.165 | 25.009 |
| 2020-04-20 | 27.325 | 25.163 |
| 2020-04-21 | 27.45 | 25.33 |
| 2020-04-22 | 27.53 | 25.334 |
| 2020-04-23 | 27.55 | 25.573 |
| 2020-04-24 | 27.31 | 25.292 |
| 2020-04-27 | 27.185 | 25.05 |
| 2020-04-28 | 27.225 | 25.036 |
| 2020-04-29 | 27.125 | 25.018 |
| 2020-04-30 | 27.095 | 24.915 |